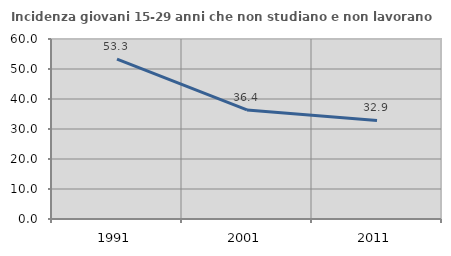
| Category | Incidenza giovani 15-29 anni che non studiano e non lavorano  |
|---|---|
| 1991.0 | 53.312 |
| 2001.0 | 36.364 |
| 2011.0 | 32.862 |